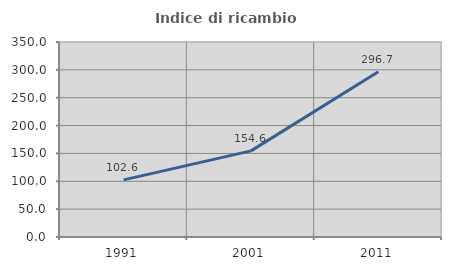
| Category | Indice di ricambio occupazionale  |
|---|---|
| 1991.0 | 102.594 |
| 2001.0 | 154.576 |
| 2011.0 | 296.667 |